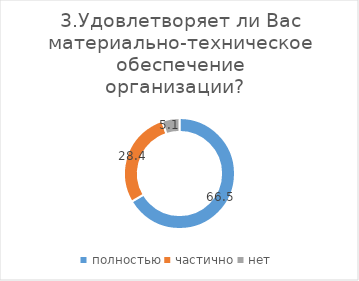
| Category | Series 0 |
|---|---|
| полностью | 66.543 |
| частично | 28.386 |
| нет | 5.071 |